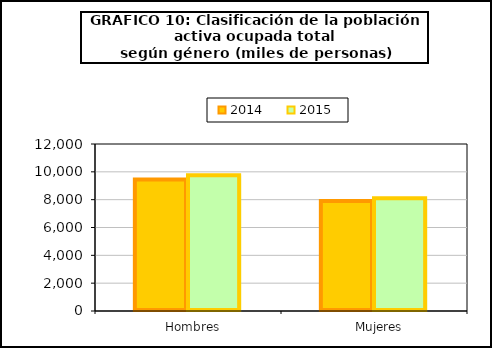
| Category | 2014 | 2015 |
|---|---|---|
|    Hombres | 9442.7 | 9760.35 |
|    Mujeres | 7901.5 | 8105.7 |